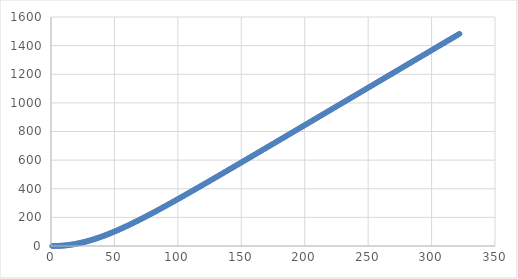
| Category | Series 0 |
|---|---|
| 0 | 0 |
| 1 | 0 |
| 2 | 0.049 |
| 3 | 0.196 |
| 4 | 0.441 |
| 5 | 0.784 |
| 6 | 1.225 |
| 7 | 1.763 |
| 8 | 2.398 |
| 9 | 3.13 |
| 10 | 3.958 |
| 11 | 4.882 |
| 12 | 5.9 |
| 13 | 7.013 |
| 14 | 8.22 |
| 15 | 9.519 |
| 16 | 10.911 |
| 17 | 12.394 |
| 18 | 13.967 |
| 19 | 15.629 |
| 20 | 17.379 |
| 21 | 19.217 |
| 22 | 21.14 |
| 23 | 23.148 |
| 24 | 25.24 |
| 25 | 27.415 |
| 26 | 29.67 |
| 27 | 32.006 |
| 28 | 34.42 |
| 29 | 36.911 |
| 30 | 39.478 |
| 31 | 42.119 |
| 32 | 44.834 |
| 33 | 47.62 |
| 34 | 50.477 |
| 35 | 53.402 |
| 36 | 56.395 |
| 37 | 59.454 |
| 38 | 62.577 |
| 39 | 65.764 |
| 40 | 69.012 |
| 41 | 72.32 |
| 42 | 75.688 |
| 43 | 79.113 |
| 44 | 82.594 |
| 45 | 86.129 |
| 46 | 89.718 |
| 47 | 93.359 |
| 48 | 97.05 |
| 49 | 100.791 |
| 50 | 104.58 |
| 51 | 108.415 |
| 52 | 112.296 |
| 53 | 116.221 |
| 54 | 120.189 |
| 55 | 124.198 |
| 56 | 128.248 |
| 57 | 132.337 |
| 58 | 136.465 |
| 59 | 140.629 |
| 60 | 144.83 |
| 61 | 149.065 |
| 62 | 153.334 |
| 63 | 157.636 |
| 64 | 161.97 |
| 65 | 166.334 |
| 66 | 170.729 |
| 67 | 175.152 |
| 68 | 179.603 |
| 69 | 184.082 |
| 70 | 188.586 |
| 71 | 193.116 |
| 72 | 197.671 |
| 73 | 202.249 |
| 74 | 206.85 |
| 75 | 211.474 |
| 76 | 216.119 |
| 77 | 220.785 |
| 78 | 225.471 |
| 79 | 230.176 |
| 80 | 234.9 |
| 81 | 239.642 |
| 82 | 244.402 |
| 83 | 249.179 |
| 84 | 253.972 |
| 85 | 258.78 |
| 86 | 263.604 |
| 87 | 268.443 |
| 88 | 273.296 |
| 89 | 278.163 |
| 90 | 283.043 |
| 91 | 287.935 |
| 92 | 292.84 |
| 93 | 297.757 |
| 94 | 302.685 |
| 95 | 307.625 |
| 96 | 312.575 |
| 97 | 317.535 |
| 98 | 322.505 |
| 99 | 327.485 |
| 100 | 332.474 |
| 101 | 337.472 |
| 102 | 342.479 |
| 103 | 347.494 |
| 104 | 352.517 |
| 105 | 357.547 |
| 106 | 362.585 |
| 107 | 367.631 |
| 108 | 372.683 |
| 109 | 377.741 |
| 110 | 382.806 |
| 111 | 387.877 |
| 112 | 392.955 |
| 113 | 398.038 |
| 114 | 403.126 |
| 115 | 408.22 |
| 116 | 413.319 |
| 117 | 418.422 |
| 118 | 423.531 |
| 119 | 428.644 |
| 120 | 433.762 |
| 121 | 438.884 |
| 122 | 444.01 |
| 123 | 449.139 |
| 124 | 454.273 |
| 125 | 459.41 |
| 126 | 464.551 |
| 127 | 469.696 |
| 128 | 474.843 |
| 129 | 479.994 |
| 130 | 485.147 |
| 131 | 490.304 |
| 132 | 495.464 |
| 133 | 500.626 |
| 134 | 505.791 |
| 135 | 510.958 |
| 136 | 516.128 |
| 137 | 521.3 |
| 138 | 526.474 |
| 139 | 531.65 |
| 140 | 536.829 |
| 141 | 542.009 |
| 142 | 547.192 |
| 143 | 552.376 |
| 144 | 557.562 |
| 145 | 562.75 |
| 146 | 567.94 |
| 147 | 573.131 |
| 148 | 578.324 |
| 149 | 583.518 |
| 150 | 588.713 |
| 151 | 593.91 |
| 152 | 599.108 |
| 153 | 604.308 |
| 154 | 609.509 |
| 155 | 614.711 |
| 156 | 619.914 |
| 157 | 625.118 |
| 158 | 630.323 |
| 159 | 635.529 |
| 160 | 640.736 |
| 161 | 645.944 |
| 162 | 651.153 |
| 163 | 656.363 |
| 164 | 661.574 |
| 165 | 666.786 |
| 166 | 671.998 |
| 167 | 677.211 |
| 168 | 682.425 |
| 169 | 687.639 |
| 170 | 692.854 |
| 171 | 698.07 |
| 172 | 703.287 |
| 173 | 708.504 |
| 174 | 713.721 |
| 175 | 718.939 |
| 176 | 724.158 |
| 177 | 729.377 |
| 178 | 734.597 |
| 179 | 739.817 |
| 180 | 745.037 |
| 181 | 750.259 |
| 182 | 755.48 |
| 183 | 760.702 |
| 184 | 765.924 |
| 185 | 771.147 |
| 186 | 776.37 |
| 187 | 781.593 |
| 188 | 786.817 |
| 189 | 792.041 |
| 190 | 797.265 |
| 191 | 802.489 |
| 192 | 807.714 |
| 193 | 812.94 |
| 194 | 818.165 |
| 195 | 823.391 |
| 196 | 828.617 |
| 197 | 833.843 |
| 198 | 839.069 |
| 199 | 844.296 |
| 200 | 849.523 |
| 201 | 854.75 |
| 202 | 859.977 |
| 203 | 865.204 |
| 204 | 870.432 |
| 205 | 875.66 |
| 206 | 880.888 |
| 207 | 886.116 |
| 208 | 891.344 |
| 209 | 896.572 |
| 210 | 901.801 |
| 211 | 907.03 |
| 212 | 912.258 |
| 213 | 917.487 |
| 214 | 922.716 |
| 215 | 927.946 |
| 216 | 933.175 |
| 217 | 938.404 |
| 218 | 943.634 |
| 219 | 948.864 |
| 220 | 954.093 |
| 221 | 959.323 |
| 222 | 964.553 |
| 223 | 969.783 |
| 224 | 975.013 |
| 225 | 980.243 |
| 226 | 985.474 |
| 227 | 990.704 |
| 228 | 995.934 |
| 229 | 1001.165 |
| 230 | 1006.395 |
| 231 | 1011.626 |
| 232 | 1016.857 |
| 233 | 1022.087 |
| 234 | 1027.318 |
| 235 | 1032.549 |
| 236 | 1037.78 |
| 237 | 1043.011 |
| 238 | 1048.242 |
| 239 | 1053.473 |
| 240 | 1058.704 |
| 241 | 1063.935 |
| 242 | 1069.166 |
| 243 | 1074.398 |
| 244 | 1079.629 |
| 245 | 1084.86 |
| 246 | 1090.092 |
| 247 | 1095.323 |
| 248 | 1100.554 |
| 249 | 1105.786 |
| 250 | 1111.017 |
| 251 | 1116.249 |
| 252 | 1121.48 |
| 253 | 1126.712 |
| 254 | 1131.943 |
| 255 | 1137.175 |
| 256 | 1142.407 |
| 257 | 1147.638 |
| 258 | 1152.87 |
| 259 | 1158.102 |
| 260 | 1163.333 |
| 261 | 1168.565 |
| 262 | 1173.797 |
| 263 | 1179.029 |
| 264 | 1184.261 |
| 265 | 1189.492 |
| 266 | 1194.724 |
| 267 | 1199.956 |
| 268 | 1205.188 |
| 269 | 1210.42 |
| 270 | 1215.652 |
| 271 | 1220.884 |
| 272 | 1226.116 |
| 273 | 1231.348 |
| 274 | 1236.58 |
| 275 | 1241.811 |
| 276 | 1247.043 |
| 277 | 1252.275 |
| 278 | 1257.507 |
| 279 | 1262.739 |
| 280 | 1267.972 |
| 281 | 1273.204 |
| 282 | 1278.436 |
| 283 | 1283.668 |
| 284 | 1288.9 |
| 285 | 1294.132 |
| 286 | 1299.364 |
| 287 | 1304.596 |
| 288 | 1309.828 |
| 289 | 1315.06 |
| 290 | 1320.292 |
| 291 | 1325.524 |
| 292 | 1330.756 |
| 293 | 1335.989 |
| 294 | 1341.221 |
| 295 | 1346.453 |
| 296 | 1351.685 |
| 297 | 1356.917 |
| 298 | 1362.149 |
| 299 | 1367.381 |
| 300 | 1372.614 |
| 301 | 1377.846 |
| 302 | 1383.078 |
| 303 | 1388.31 |
| 304 | 1393.542 |
| 305 | 1398.774 |
| 306 | 1404.007 |
| 307 | 1409.239 |
| 308 | 1414.471 |
| 309 | 1419.703 |
| 310 | 1424.935 |
| 311 | 1430.168 |
| 312 | 1435.4 |
| 313 | 1440.632 |
| 314 | 1445.864 |
| 315 | 1451.096 |
| 316 | 1456.329 |
| 317 | 1461.561 |
| 318 | 1466.793 |
| 319 | 1472.025 |
| 320 | 1477.258 |
| 321 | 1482.49 |